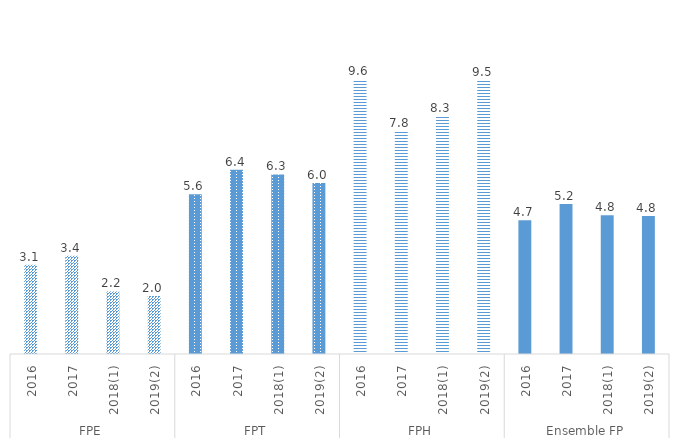
| Category | Apprentis en situation de handicap |
|---|---|
| 0 | 3.112 |
| 1 | 3.423 |
| 2 | 2.184 |
| 3 | 2.023 |
| 4 | 5.575 |
| 5 | 6.425 |
| 6 | 6.266 |
| 7 | 5.967 |
| 8 | 9.583 |
| 9 | 7.769 |
| 10 | 8.309 |
| 11 | 9.547 |
| 12 | 4.662 |
| 13 | 5.229 |
| 14 | 4.84 |
| 15 | 4.81 |